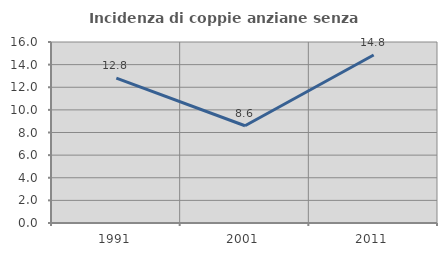
| Category | Incidenza di coppie anziane senza figli  |
|---|---|
| 1991.0 | 12.81 |
| 2001.0 | 8.597 |
| 2011.0 | 14.847 |